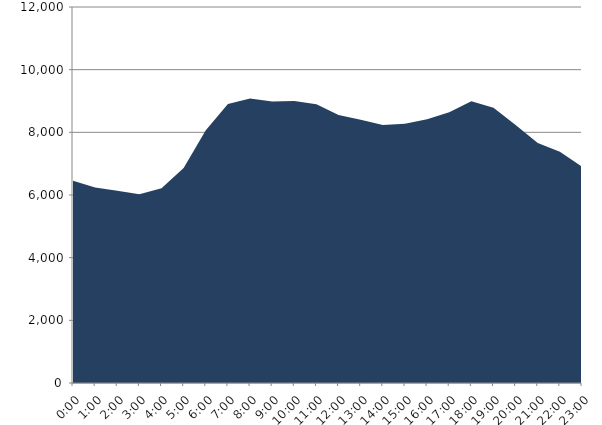
| Category | Series 0 | Series 1 |
|---|---|---|
| 2022-10-19 |  | 6455.518 |
| 2022-10-19 01:00:00 |  | 6236.84 |
| 2022-10-19 02:00:00 |  | 6138.888 |
| 2022-10-19 03:00:00 |  | 6024 |
| 2022-10-19 04:00:00 |  | 6212.645 |
| 2022-10-19 05:00:00 |  | 6865.299 |
| 2022-10-19 06:00:00 |  | 8062.67 |
| 2022-10-19 07:00:00 |  | 8908.141 |
| 2022-10-19 08:00:00 |  | 9079.247 |
| 2022-10-19 09:00:00 |  | 8982.524 |
| 2022-10-19 10:00:00 |  | 8997.202 |
| 2022-10-19 11:00:00 |  | 8892.806 |
| 2022-10-19 12:00:00 |  | 8549.625 |
| 2022-10-19 13:00:00 |  | 8402.853 |
| 2022-10-19 14:00:00 |  | 8235.672 |
| 2022-10-19 15:00:00 |  | 8272.28 |
| 2022-10-19 16:00:00 |  | 8414.4 |
| 2022-10-19 17:00:00 |  | 8640.902 |
| 2022-10-19 18:00:00 |  | 8995.383 |
| 2022-10-19 19:00:00 |  | 8781.271 |
| 2022-10-19 20:00:00 |  | 8233.023 |
| 2022-10-19 21:00:00 |  | 7662.947 |
| 2022-10-19 22:00:00 |  | 7378.128 |
| 2022-10-19 23:00:00 |  | 6902.814 |